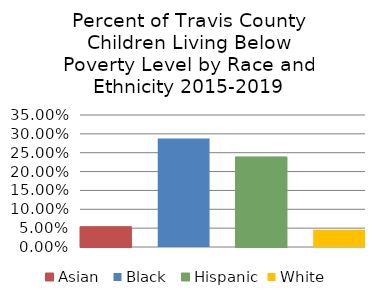
| Category | Asian  | Black  | Hispanic | White |
|---|---|---|---|---|
| 2019.0 | 0.054 | 0.288 | 0.239 | 0.046 |